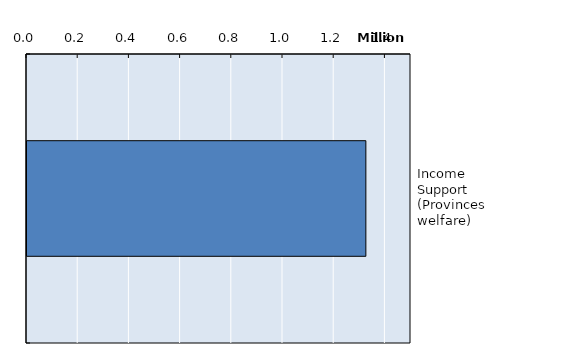
| Category | Series 0 |
|---|---|
| Income Support (Provinces welfare) | 1323687.833 |